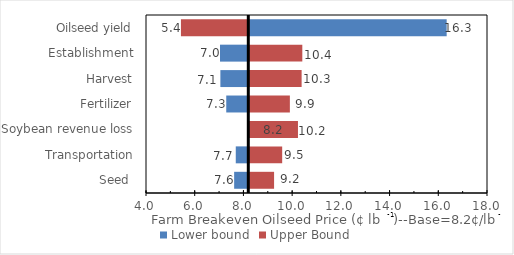
| Category | Lower bound | Upper Bound |
|---|---|---|
| Seed  | 7.619 | 9.217 |
| Transportation | 7.685 | 9.55 |
| Soybean revenue loss | 8.152 | 10.198 |
| Fertilizer | 7.295 | 9.866 |
| Harvest | 7.053 | 10.348 |
| Establishment | 7.039 | 10.376 |
| Oilseed yield | 16.303 | 5.434 |